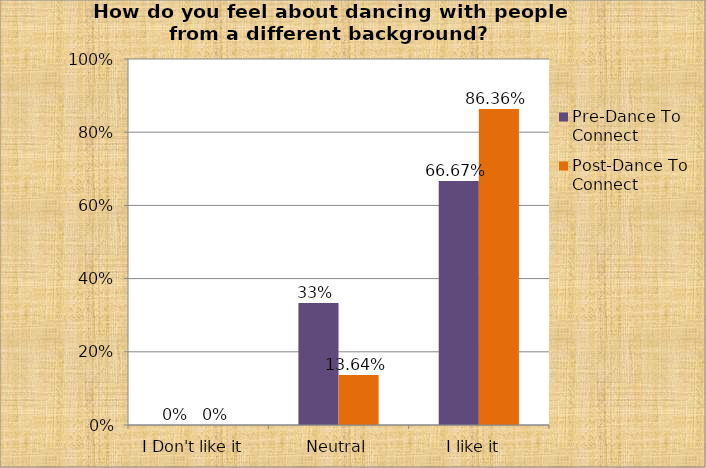
| Category | Pre-Dance To Connect | Post-Dance To Connect |
|---|---|---|
| I Don't like it  | 0 | 0 |
| Neutral | 0.333 | 0.136 |
| I like it  | 0.667 | 0.864 |